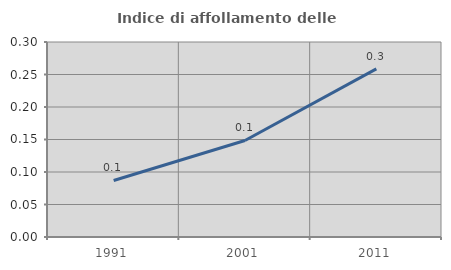
| Category | Indice di affollamento delle abitazioni  |
|---|---|
| 1991.0 | 0.087 |
| 2001.0 | 0.148 |
| 2011.0 | 0.259 |